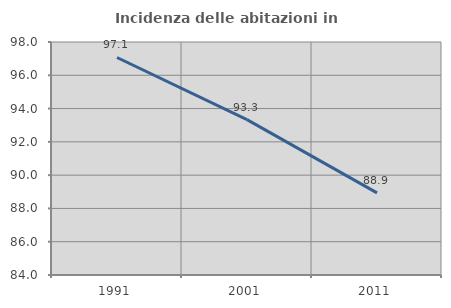
| Category | Incidenza delle abitazioni in proprietà  |
|---|---|
| 1991.0 | 97.07 |
| 2001.0 | 93.333 |
| 2011.0 | 88.936 |